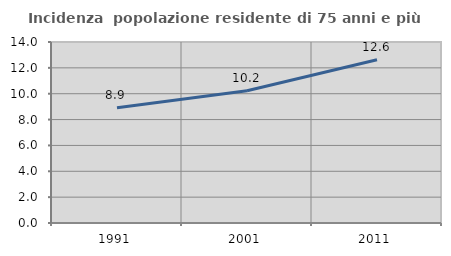
| Category | Incidenza  popolazione residente di 75 anni e più |
|---|---|
| 1991.0 | 8.917 |
| 2001.0 | 10.233 |
| 2011.0 | 12.631 |